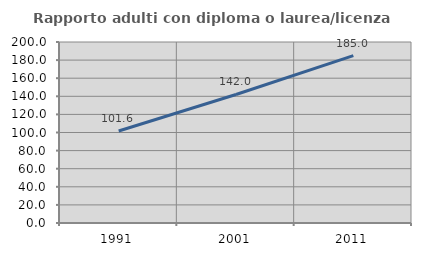
| Category | Rapporto adulti con diploma o laurea/licenza media  |
|---|---|
| 1991.0 | 101.619 |
| 2001.0 | 142.031 |
| 2011.0 | 184.957 |